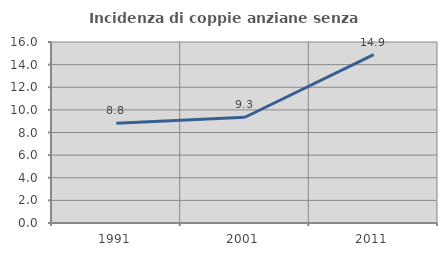
| Category | Incidenza di coppie anziane senza figli  |
|---|---|
| 1991.0 | 8.816 |
| 2001.0 | 9.347 |
| 2011.0 | 14.891 |